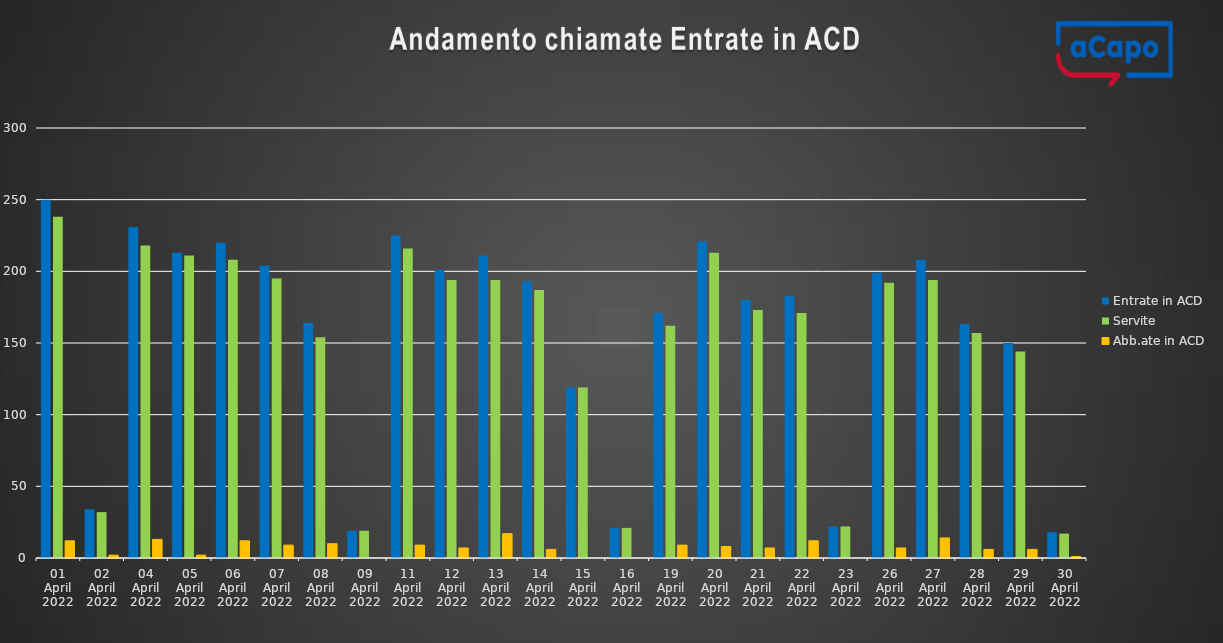
| Category | Entrate in ACD | Servite | Abb.ate in ACD |
|---|---|---|---|
| 2022-04-01 | 250 | 238 | 12 |
| 2022-04-02 | 34 | 32 | 2 |
| 2022-04-04 | 231 | 218 | 13 |
| 2022-04-05 | 213 | 211 | 2 |
| 2022-04-06 | 220 | 208 | 12 |
| 2022-04-07 | 204 | 195 | 9 |
| 2022-04-08 | 164 | 154 | 10 |
| 2022-04-09 | 19 | 19 | 0 |
| 2022-04-11 | 225 | 216 | 9 |
| 2022-04-12 | 201 | 194 | 7 |
| 2022-04-13 | 211 | 194 | 17 |
| 2022-04-14 | 193 | 187 | 6 |
| 2022-04-15 | 119 | 119 | 0 |
| 2022-04-16 | 21 | 21 | 0 |
| 2022-04-19 | 171 | 162 | 9 |
| 2022-04-20 | 221 | 213 | 8 |
| 2022-04-21 | 180 | 173 | 7 |
| 2022-04-22 | 183 | 171 | 12 |
| 2022-04-23 | 22 | 22 | 0 |
| 2022-04-26 | 199 | 192 | 7 |
| 2022-04-27 | 208 | 194 | 14 |
| 2022-04-28 | 163 | 157 | 6 |
| 2022-04-29 | 150 | 144 | 6 |
| 2022-04-30 | 18 | 17 | 1 |